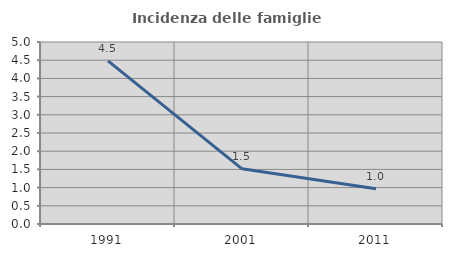
| Category | Incidenza delle famiglie numerose |
|---|---|
| 1991.0 | 4.479 |
| 2001.0 | 1.515 |
| 2011.0 | 0.966 |